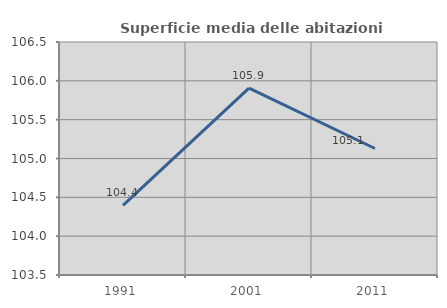
| Category | Superficie media delle abitazioni occupate |
|---|---|
| 1991.0 | 104.397 |
| 2001.0 | 105.906 |
| 2011.0 | 105.128 |